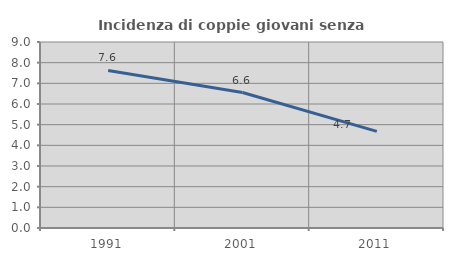
| Category | Incidenza di coppie giovani senza figli |
|---|---|
| 1991.0 | 7.625 |
| 2001.0 | 6.554 |
| 2011.0 | 4.676 |